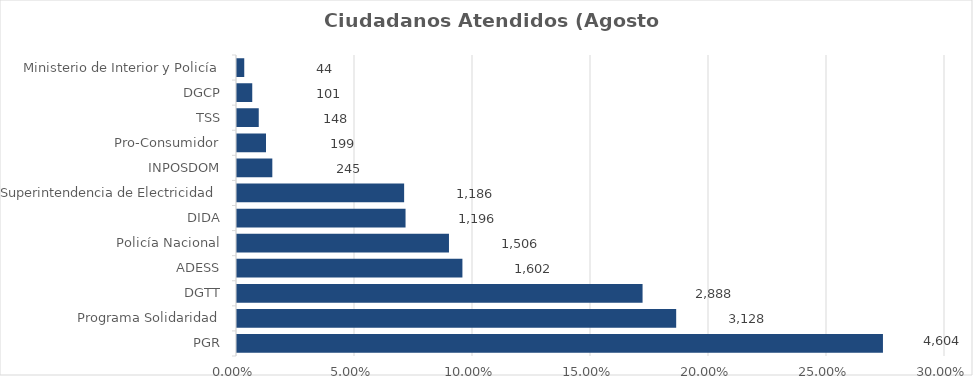
| Category | Porcentaje |
|---|---|
| PGR | 0.273 |
| Programa Solidaridad | 0.186 |
| DGTT | 0.171 |
| ADESS | 0.095 |
| Policía Nacional | 0.089 |
| DIDA | 0.071 |
| Superintendencia de Electricidad | 0.07 |
| INPOSDOM | 0.015 |
| Pro-Consumidor | 0.012 |
| TSS | 0.009 |
| DGCP | 0.006 |
| Ministerio de Interior y Policía | 0.003 |